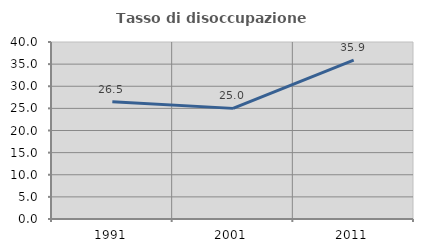
| Category | Tasso di disoccupazione giovanile  |
|---|---|
| 1991.0 | 26.506 |
| 2001.0 | 25 |
| 2011.0 | 35.897 |